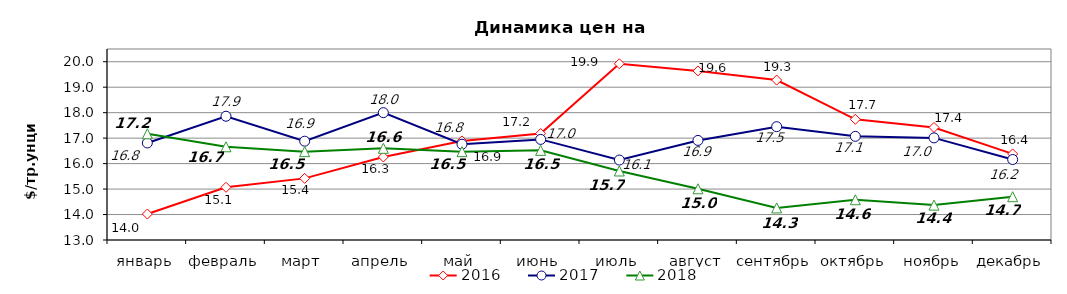
| Category | 2016 | 2017 | 2018 |
|---|---|---|---|
| январь | 14.02 | 16.81 | 17.17 |
| февраль | 15.07 | 17.86 | 16.66 |
| март | 15.42 | 16.88 | 16.47 |
| апрель | 16.26 | 18 | 16.6 |
| май | 16.89 | 16.76 | 16.47 |
| июнь | 17.18 | 16.95 | 16.52 |
| июль | 19.92 | 16.14 | 15.71 |
| август | 19.64 | 16.91 | 15.01 |
| сентябрь | 19.28 | 17.45 | 14.26 |
| октябрь | 17.74 | 17.07 | 14.58 |
| ноябрь | 17.42 | 17.01 | 14.37 |
| декабрь | 16.38 | 16.16 | 14.7 |